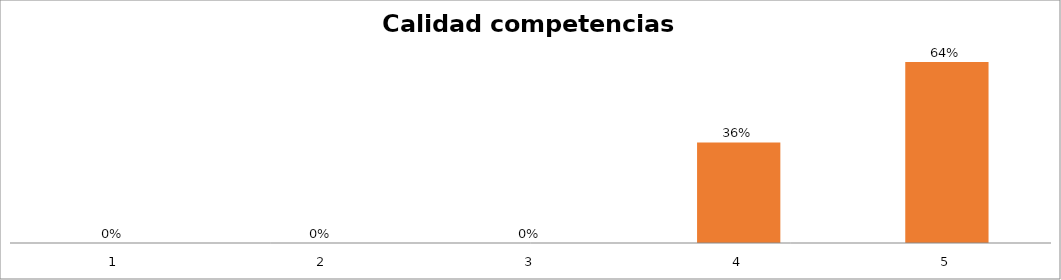
| Category | Series 1 |
|---|---|
| 0 | 0 |
| 1 | 0 |
| 2 | 0 |
| 3 | 0.357 |
| 4 | 0.643 |